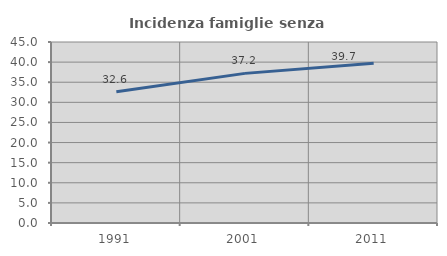
| Category | Incidenza famiglie senza nuclei |
|---|---|
| 1991.0 | 32.625 |
| 2001.0 | 37.201 |
| 2011.0 | 39.721 |